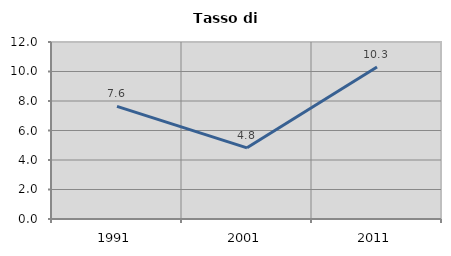
| Category | Tasso di disoccupazione   |
|---|---|
| 1991.0 | 7.637 |
| 2001.0 | 4.824 |
| 2011.0 | 10.31 |